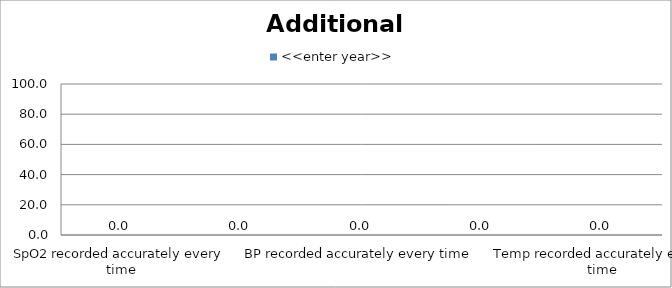
| Category | <<enter year>> |
|---|---|
| SpO2 recorded accurately every time | 0 |
| CRT recorded accurately every time | 0 |
| BP recorded accurately every time | 0 |
| Skin Colour recorded accurately every time | 0 |
| Temp recorded accurately every time | 0 |